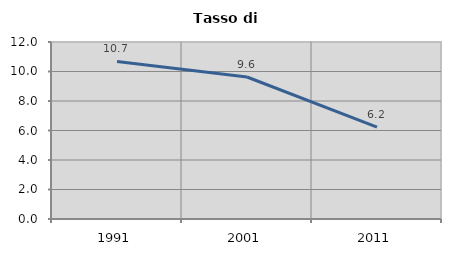
| Category | Tasso di disoccupazione   |
|---|---|
| 1991.0 | 10.68 |
| 2001.0 | 9.628 |
| 2011.0 | 6.229 |